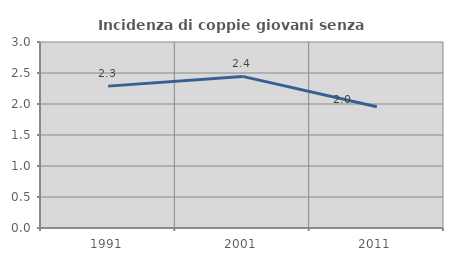
| Category | Incidenza di coppie giovani senza figli |
|---|---|
| 1991.0 | 2.288 |
| 2001.0 | 2.445 |
| 2011.0 | 1.955 |